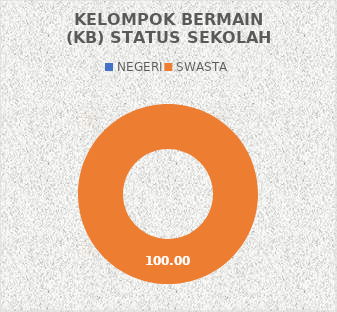
| Category | KELOMPOK BERMAIN (KB) STATUS SEKOLAH |
|---|---|
| NEGERI | 0 |
| SWASTA | 375 |